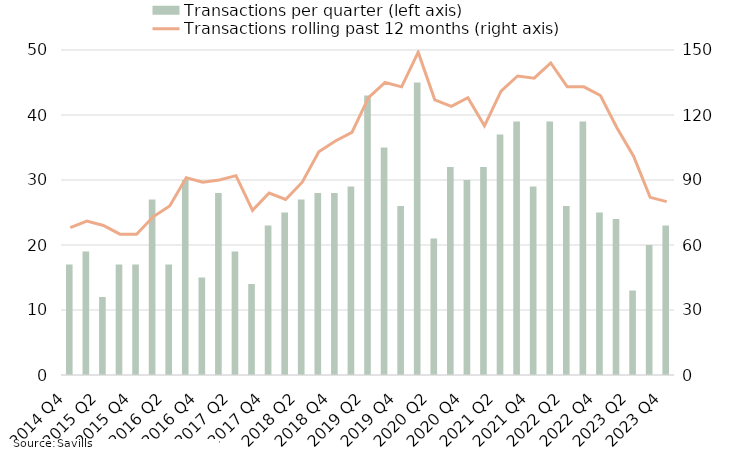
| Category | Transactions per quarter (left axis) |
|---|---|
| 2014 Q4 | 17 |
| 2015 Q1 | 19 |
| 2015 Q2 | 12 |
| 2015 Q3 | 17 |
| 2015 Q4 | 17 |
| 2016 Q1 | 27 |
| 2016 Q2 | 17 |
| 2016 Q3 | 30 |
| 2016 Q4 | 15 |
| 2017 Q1 | 28 |
| 2017 Q2 | 19 |
| 2017 Q3 | 14 |
| 2017 Q4 | 23 |
| 2018 Q1 | 25 |
| 2018 Q2 | 27 |
| 2018 Q3 | 28 |
| 2018 Q4 | 28 |
| 2019 Q1 | 29 |
| 2019 Q2 | 43 |
| 2019 Q3 | 35 |
| 2019 Q4 | 26 |
| 2020 Q1 | 45 |
| 2020 Q2 | 21 |
| 2020 Q3 | 32 |
| 2020 Q4 | 30 |
| 2021 Q1 | 32 |
| 2021 Q2 | 37 |
| 2021 Q3 | 39 |
| 2021 Q4 | 29 |
| 2022 Q1 | 39 |
| 2022 Q2 | 26 |
| 2022 Q3 | 39 |
| 2022 Q4 | 25 |
| 2023 Q1 | 24 |
| 2023 Q2 | 13 |
| 2023 Q3 | 20 |
| 2023 Q4 | 23 |